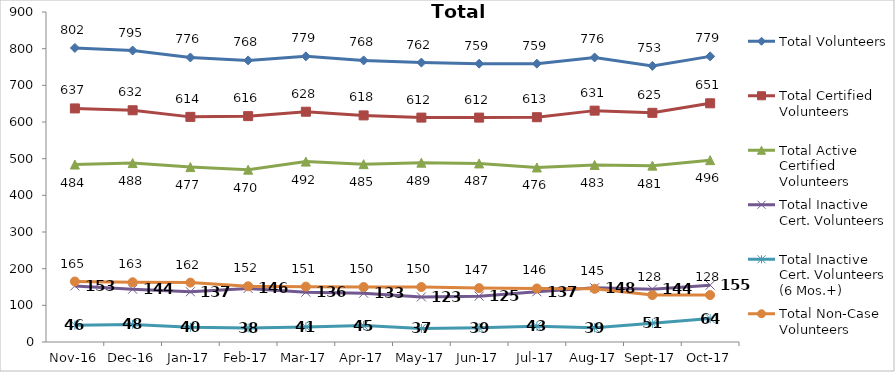
| Category | Total Volunteers | Total Certified Volunteers | Total Active Certified Volunteers | Total Inactive Cert. Volunteers | Total Inactive Cert. Volunteers (6 Mos.+) | Total Non-Case Volunteers |
|---|---|---|---|---|---|---|
| 2016-11-01 | 802 | 637 | 484 | 153 | 46 | 165 |
| 2016-12-01 | 795 | 632 | 488 | 144 | 48 | 163 |
| 2017-01-01 | 776 | 614 | 477 | 137 | 40 | 162 |
| 2017-02-01 | 768 | 616 | 470 | 146 | 38 | 152 |
| 2017-03-01 | 779 | 628 | 492 | 136 | 41 | 151 |
| 2017-04-01 | 768 | 618 | 485 | 133 | 45 | 150 |
| 2017-05-01 | 762 | 612 | 489 | 123 | 37 | 150 |
| 2017-06-01 | 759 | 612 | 487 | 125 | 39 | 147 |
| 2017-07-01 | 759 | 613 | 476 | 137 | 43 | 146 |
| 2017-08-01 | 776 | 631 | 483 | 148 | 39 | 145 |
| 2017-09-01 | 753 | 625 | 481 | 144 | 51 | 128 |
| 2017-10-01 | 779 | 651 | 496 | 155 | 64 | 128 |